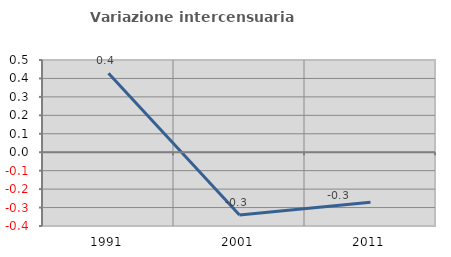
| Category | Variazione intercensuaria annua |
|---|---|
| 1991.0 | 0.428 |
| 2001.0 | -0.34 |
| 2011.0 | -0.271 |